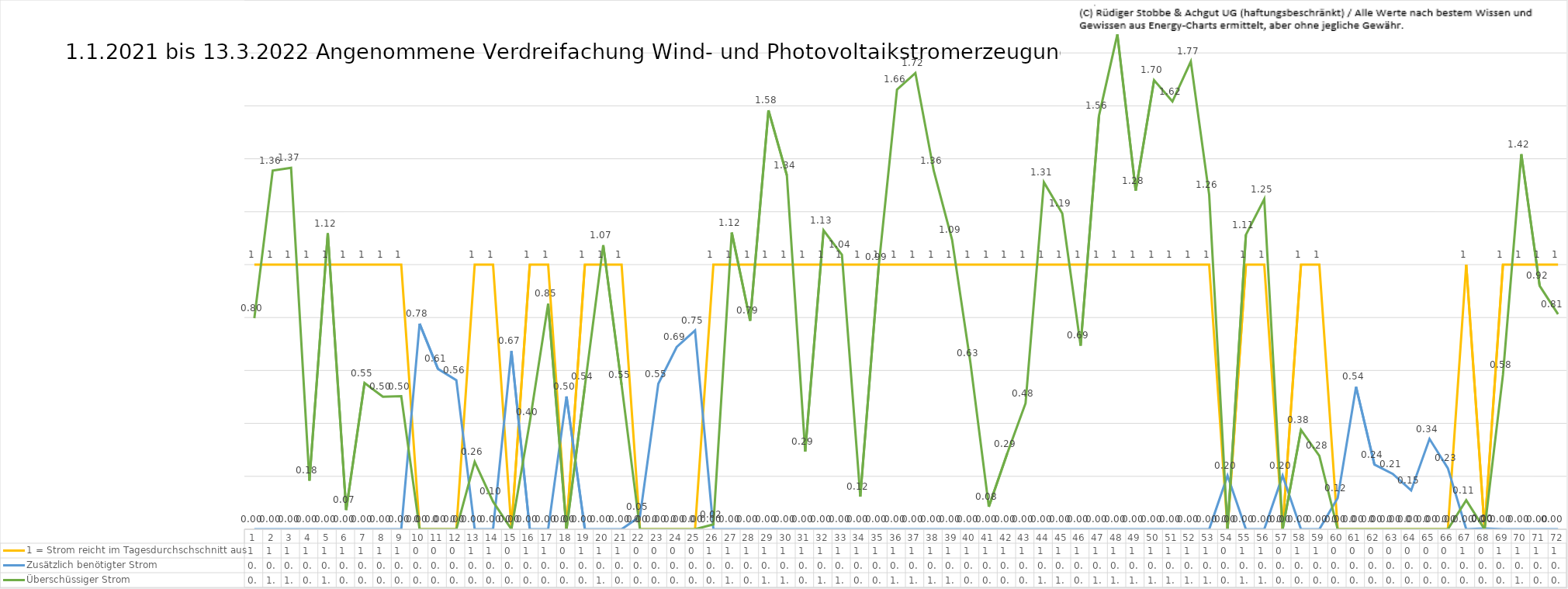
| Category | 1 = Strom reicht im Tagesdurchschschnitt aus | Zusätzlich benötigter Strom | Überschüssiger Strom |
|---|---|---|---|
| 0 | 1 | 0 | 0.798 |
| 1 | 1 | 0 | 1.356 |
| 2 | 1 | 0 | 1.366 |
| 3 | 1 | 0 | 0.184 |
| 4 | 1 | 0 | 1.118 |
| 5 | 1 | 0 | 0.073 |
| 6 | 1 | 0 | 0.553 |
| 7 | 1 | 0 | 0.501 |
| 8 | 1 | 0 | 0.503 |
| 9 | 0 | 0.777 | 0 |
| 10 | 0 | 0.606 | 0 |
| 11 | 0 | 0.563 | 0 |
| 12 | 1 | 0 | 0.255 |
| 13 | 1 | 0 | 0.104 |
| 14 | 0 | 0.673 | 0 |
| 15 | 1 | 0 | 0.405 |
| 16 | 1 | 0 | 0.852 |
| 17 | 0 | 0.502 | 0 |
| 18 | 1 | 0 | 0.54 |
| 19 | 1 | 0 | 1.074 |
| 20 | 1 | 0 | 0.546 |
| 21 | 0 | 0.048 | 0 |
| 22 | 0 | 0.55 | 0 |
| 23 | 0 | 0.688 | 0 |
| 24 | 0 | 0.751 | 0 |
| 25 | 1 | 0 | 0.018 |
| 26 | 1 | 0 | 1.121 |
| 27 | 1 | 0 | 0.788 |
| 28 | 1 | 0 | 1.583 |
| 29 | 1 | 0 | 1.338 |
| 30 | 1 | 0 | 0.293 |
| 31 | 1 | 0 | 1.13 |
| 32 | 1 | 0 | 1.037 |
| 33 | 1 | 0 | 0.123 |
| 34 | 1 | 0 | 0.992 |
| 35 | 1 | 0 | 1.662 |
| 36 | 1 | 0 | 1.724 |
| 37 | 1 | 0 | 1.355 |
| 38 | 1 | 0 | 1.094 |
| 39 | 1 | 0 | 0.628 |
| 40 | 1 | 0 | 0.085 |
| 41 | 1 | 0 | 0.286 |
| 42 | 1 | 0 | 0.476 |
| 43 | 1 | 0 | 1.311 |
| 44 | 1 | 0 | 1.194 |
| 45 | 1 | 0 | 0.694 |
| 46 | 1 | 0 | 1.563 |
| 47 | 1 | 0 | 1.87 |
| 48 | 1 | 0 | 1.28 |
| 49 | 1 | 0 | 1.697 |
| 50 | 1 | 0 | 1.616 |
| 51 | 1 | 0 | 1.767 |
| 52 | 1 | 0 | 1.264 |
| 53 | 0 | 0.202 | 0 |
| 54 | 1 | 0 | 1.112 |
| 55 | 1 | 0 | 1.247 |
| 56 | 0 | 0.202 | 0 |
| 57 | 1 | 0 | 0.376 |
| 58 | 1 | 0 | 0.278 |
| 59 | 0 | 0.118 | 0 |
| 60 | 0 | 0.538 | 0 |
| 61 | 0 | 0.244 | 0 |
| 62 | 0 | 0.209 | 0 |
| 63 | 0 | 0.147 | 0 |
| 64 | 0 | 0.341 | 0 |
| 65 | 0 | 0.231 | 0 |
| 66 | 1 | 0 | 0.11 |
| 67 | 0 | 0.003 | 0 |
| 68 | 1 | 0 | 0.584 |
| 69 | 1 | 0 | 1.417 |
| 70 | 1 | 0 | 0.92 |
| 71 | 1 | 0 | 0.813 |